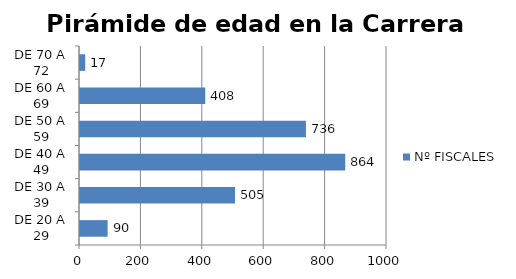
| Category | Nº FISCALES |
|---|---|
| DE 20 A 29 | 90 |
| DE 30 A 39 | 505 |
| DE 40 A 49 | 864 |
| DE 50 A 59 | 736 |
| DE 60 A 69 | 408 |
| DE 70 A 72 | 17 |